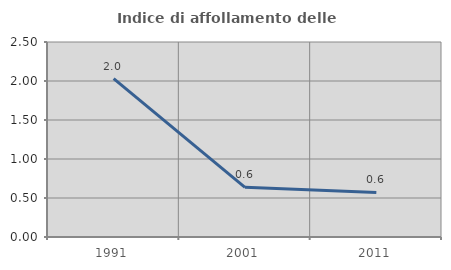
| Category | Indice di affollamento delle abitazioni  |
|---|---|
| 1991.0 | 2.029 |
| 2001.0 | 0.637 |
| 2011.0 | 0.571 |